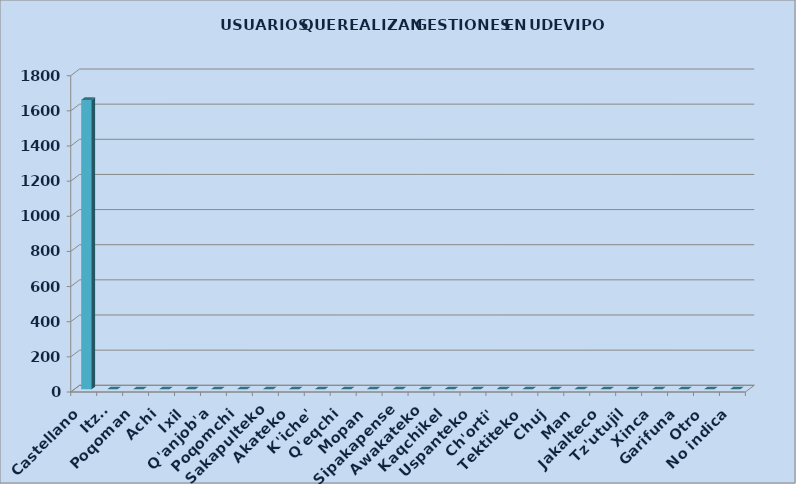
| Category | Series 0 |
|---|---|
| Castellano | 1647 |
| Itza' | 0 |
| Poqoman | 0 |
| Achi | 0 |
| Ixil | 0 |
| Q'anjob'a | 0 |
| Poqomchi | 0 |
| Sakapulteko | 0 |
| Akateko | 0 |
| K'iche' | 0 |
| Q'eqchi | 0 |
| Mopan | 0 |
| Sipakapense | 0 |
| Awakateko | 0 |
| Kaqchikel | 0 |
| Uspanteko | 0 |
| Ch'orti' | 0 |
| Tektiteko | 0 |
| Chuj | 0 |
| Man | 0 |
| Jakalteco | 0 |
| Tz'utujil | 0 |
| Xinca | 0 |
| Garifuna | 0 |
| Otro | 0 |
| No indica | 0 |